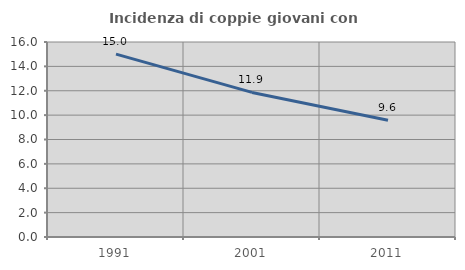
| Category | Incidenza di coppie giovani con figli |
|---|---|
| 1991.0 | 15.003 |
| 2001.0 | 11.862 |
| 2011.0 | 9.585 |